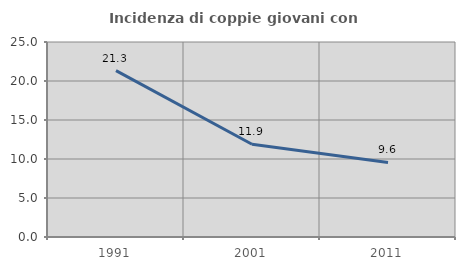
| Category | Incidenza di coppie giovani con figli |
|---|---|
| 1991.0 | 21.338 |
| 2001.0 | 11.888 |
| 2011.0 | 9.562 |